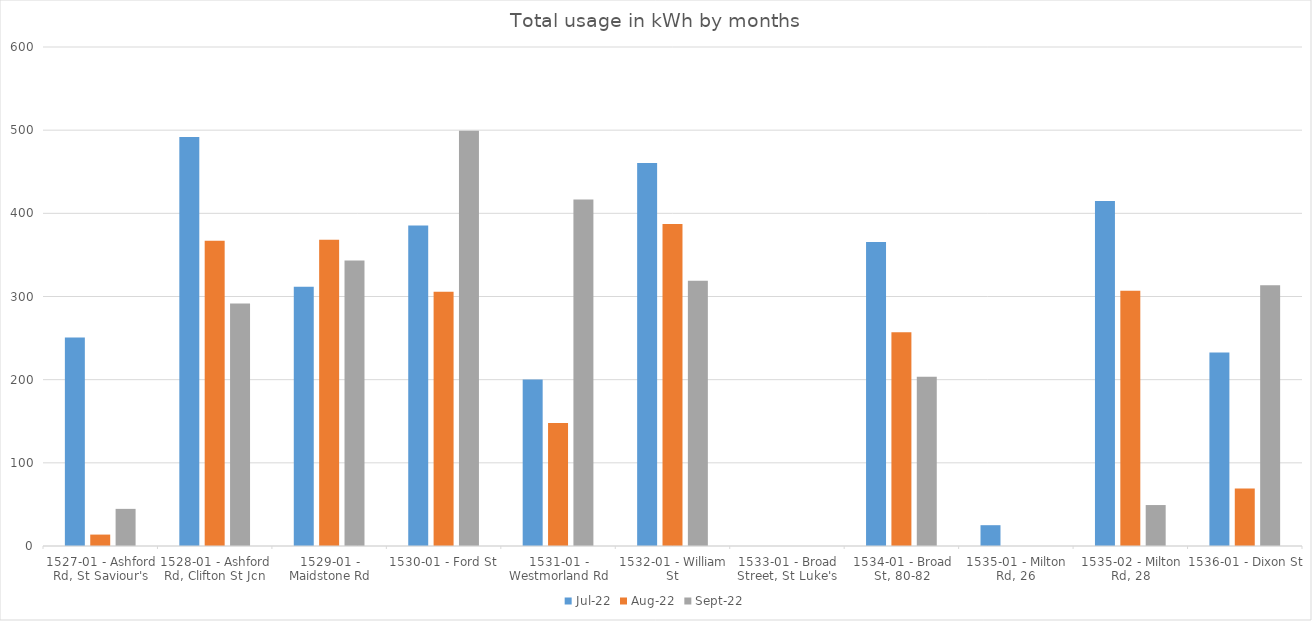
| Category | Jul-22 | Aug-22 | Sep-22 |
|---|---|---|---|
| 1527-01 - Ashford Rd, St Saviour's | 250.84 | 13.73 | 44.64 |
| 1528-01 - Ashford Rd, Clifton St Jcn | 491.69 | 366.91 | 291.73 |
| 1529-01 - Maidstone Rd | 311.67 | 368.24 | 343.28 |
| 1530-01 - Ford St | 385.41 | 305.8 | 499.37 |
| 1531-01 - Westmorland Rd | 200.07 | 148.02 | 416.63 |
| 1532-01 - William St | 460.66 | 387.17 | 318.8 |
| 1533-01 - Broad Street, St Luke's | 0 | 0 | 0 |
| 1534-01 - Broad St, 80-82 | 365.61 | 257 | 203.43 |
| 1535-01 - Milton Rd, 26 | 25.02 | 0 | 0 |
| 1535-02 - Milton Rd, 28 | 414.87 | 307.02 | 49.25 |
| 1536-01 - Dixon St | 232.72 | 69.07 | 313.63 |